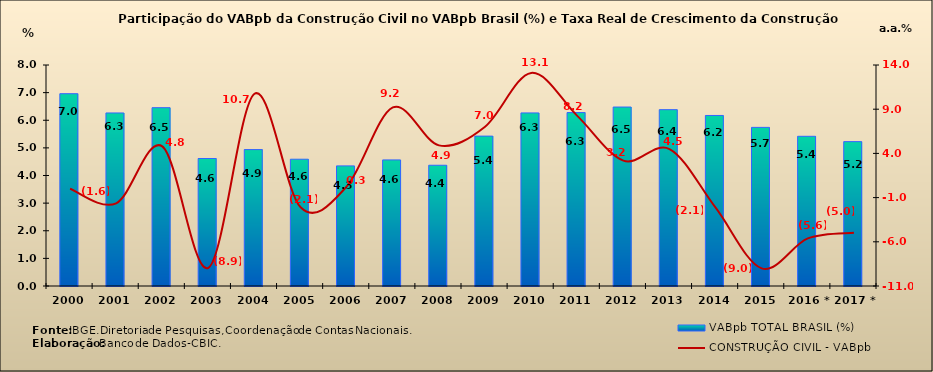
| Category | VABpb TOTAL BRASIL (%) |
|---|---|
| 2000 | 6.96 |
| 2001 | 6.264 |
| 2002 | 6.454 |
| 2003 | 4.615 |
| 2004 | 4.937 |
| 2005 | 4.589 |
| 2006 | 4.348 |
| 2007 | 4.564 |
| 2008 | 4.371 |
| 2009 | 5.426 |
| 2010 | 6.265 |
| 2011 | 6.277 |
| 2012 | 6.478 |
| 2013 | 6.382 |
| 2014 | 6.173 |
| 2015 | 5.742 |
| 2016 * | 5.419 |
| 2017 * | 5.226 |